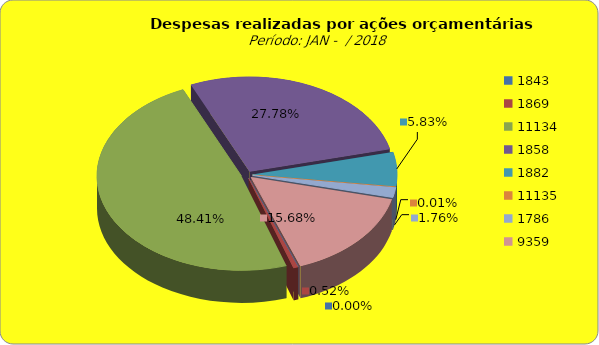
| Category | Series 1 |
|---|---|
| 1843.0 | 0 |
| 1869.0 | 179013.07 |
| 11134.0 | 16666550.41 |
| 1858.0 | 9565115.58 |
| 1882.0 | 2008516.2 |
| 11135.0 | 4050 |
| 1786.0 | 606962.77 |
| 9359.0 | 5396382.28 |